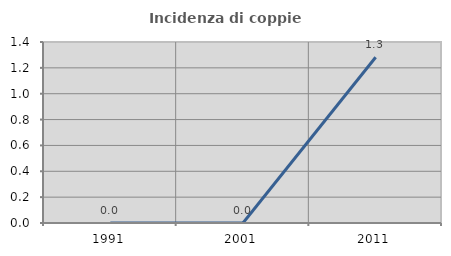
| Category | Incidenza di coppie miste |
|---|---|
| 1991.0 | 0 |
| 2001.0 | 0 |
| 2011.0 | 1.282 |